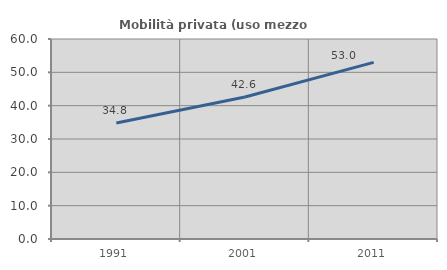
| Category | Mobilità privata (uso mezzo privato) |
|---|---|
| 1991.0 | 34.776 |
| 2001.0 | 42.586 |
| 2011.0 | 52.99 |